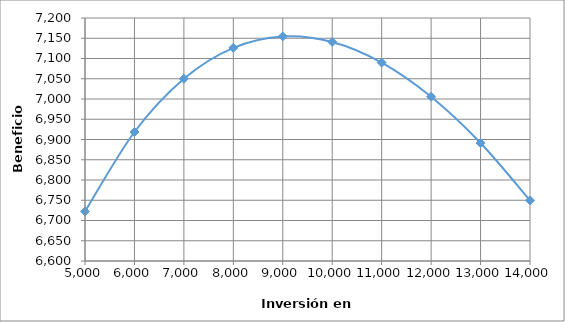
| Category | Series 0 |
|---|---|
| 4000.0 | 6448.354 |
| 5000.0 | 6722.12 |
| 6000.0 | 6918.467 |
| 7000.0 | 7050 |
| 8000.0 | 7126.235 |
| 9000.0 | 7154.565 |
| 10000.0 | 7140.868 |
| 11000.0 | 7089.912 |
| 12000.0 | 7005.624 |
| 13000.0 | 6891.289 |
| 14000.0 | 6749.683 |